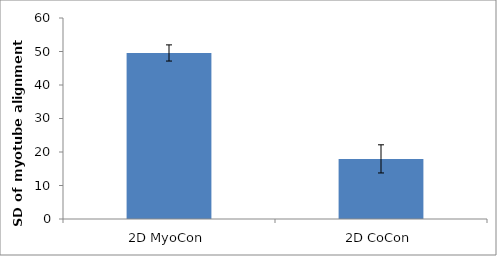
| Category | Series 0 |
|---|---|
| 2D MyoCon | 49.561 |
| 2D CoCon | 17.945 |